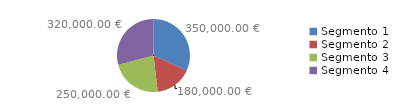
| Category | Series 0 |
|---|---|
| Segmento 1 | 350000 |
| Segmento 2 | 180000 |
| Segmento 3 | 250000 |
| Segmento 4 | 320000 |